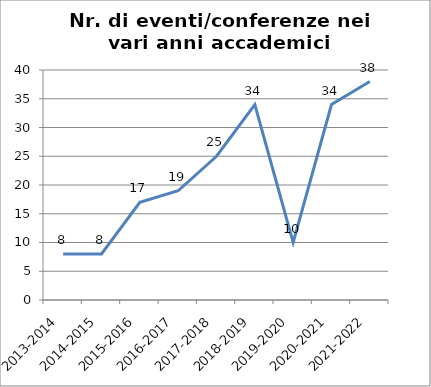
| Category | Nr. Eventi/Conferenze |
|---|---|
| 2013-2014 | 8 |
| 2014-2015 | 8 |
| 2015-2016 | 17 |
| 2016-2017 | 19 |
| 2017-2018 | 25 |
| 2018-2019 | 34 |
| 2019-2020 | 10 |
| 2020-2021 | 34 |
| 2021-2022 | 38 |